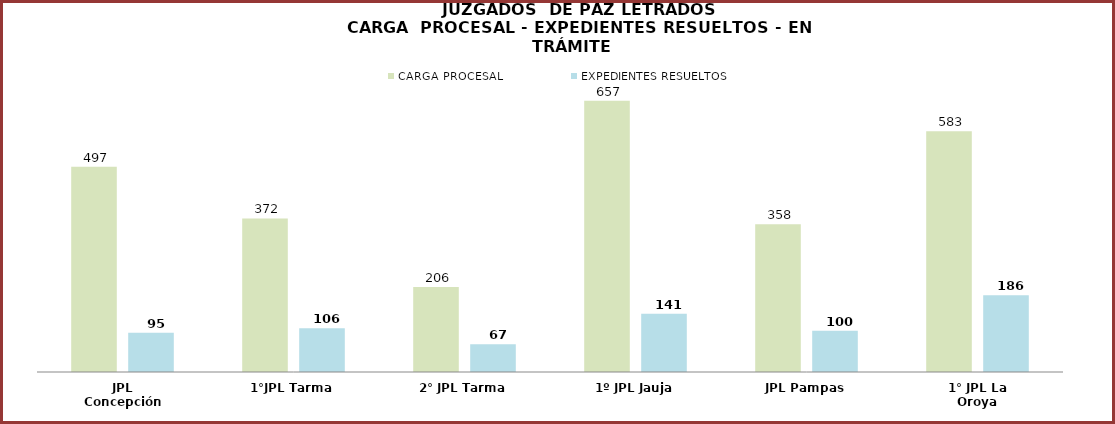
| Category | CARGA PROCESAL | EXPEDIENTES RESUELTOS |
|---|---|---|
| JPL Concepción | 497 | 95 |
| 1°JPL Tarma | 372 | 106 |
| 2° JPL Tarma | 206 | 67 |
| 1º JPL Jauja | 657 | 141 |
| JPL Pampas | 358 | 100 |
| 1° JPL La Oroya | 583 | 186 |